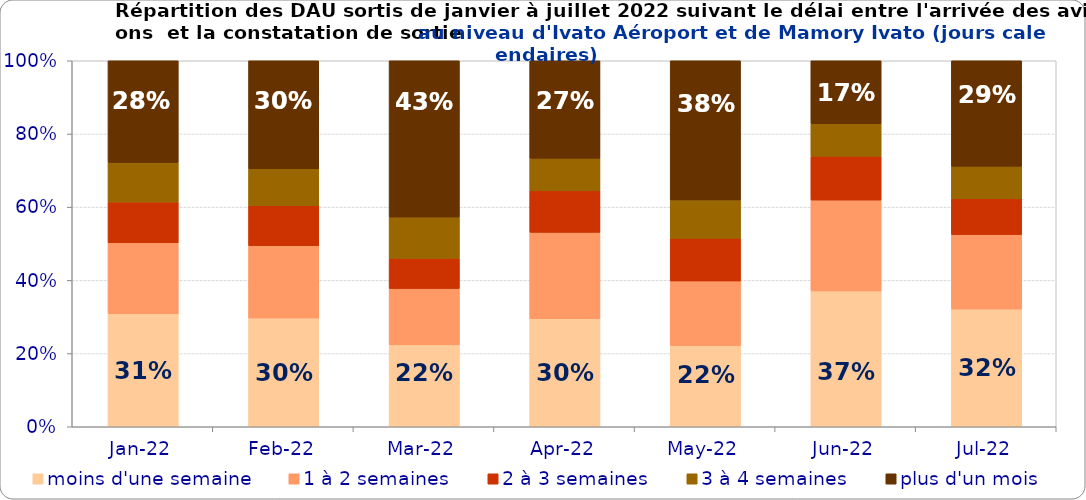
| Category | moins d'une semaine | 1 à 2 semaines | 2 à 3 semaines | 3 à 4 semaines | plus d'un mois |
|---|---|---|---|---|---|
| 2022-01-01 | 0.309 | 0.194 | 0.112 | 0.108 | 0.278 |
| 2022-02-01 | 0.297 | 0.197 | 0.109 | 0.101 | 0.295 |
| 2022-03-01 | 0.224 | 0.154 | 0.082 | 0.113 | 0.427 |
| 2022-04-01 | 0.295 | 0.236 | 0.114 | 0.089 | 0.266 |
| 2022-05-01 | 0.222 | 0.177 | 0.117 | 0.105 | 0.38 |
| 2022-06-01 | 0.371 | 0.248 | 0.12 | 0.089 | 0.172 |
| 2022-07-01 | 0.322 | 0.204 | 0.098 | 0.088 | 0.288 |